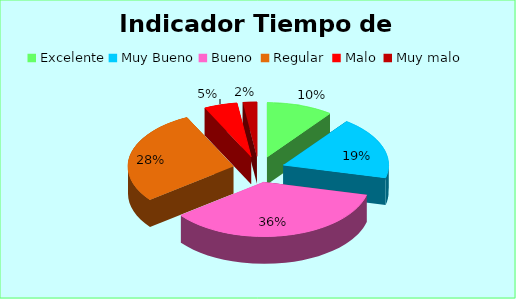
| Category | Series 0 |
|---|---|
| Excelente | 0.102 |
| Muy Bueno | 0.185 |
| Bueno  | 0.358 |
| Regular  | 0.282 |
| Malo  | 0.051 |
| Muy malo  | 0.022 |